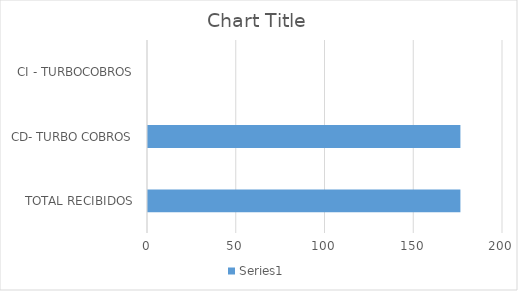
| Category | Series 0 |
|---|---|
| TOTAL RECIBIDOS | 176 |
| CD- TURBO COBROS | 176 |
| CI - TURBOCOBROS | 0 |